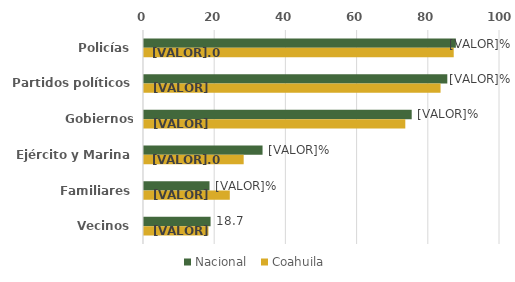
| Category | Nacional  | Coahuila |
|---|---|---|
| Policías | 87.6 | 87 |
| Partidos políticos | 85.2 | 83.3 |
| Gobiernos Estatales | 75.2 | 73.4 |
| Ejército y Marina | 33.3 | 28 |
| Familiares | 18.4 | 24.1 |
| Vecinos | 18.7 | 18.1 |